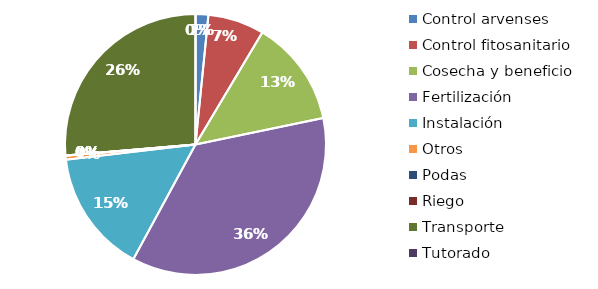
| Category | Valor |
|---|---|
| Control arvenses | 242216 |
| Control fitosanitario | 1065064 |
| Cosecha y beneficio | 2013544.669 |
| Fertilización | 5527203 |
| Instalación | 2326762.728 |
| Otros | 78305 |
| Podas | 0 |
| Riego | 0 |
| Transporte | 4026600 |
| Tutorado | 0 |